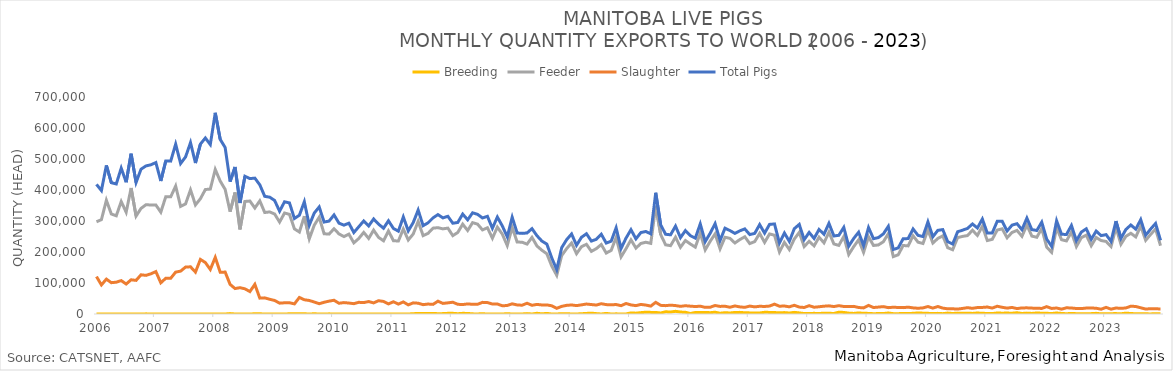
| Category | Breeding | Feeder | Slaughter | Total Pigs |
|---|---|---|---|---|
| 2006-01-01 | 0 | 297447 | 120678 | 418125 |
| 2006-02-01 | 0 | 304391 | 93850 | 398241 |
| 2006-03-01 | 0 | 366922 | 112463 | 479385 |
| 2006-04-01 | 0 | 322576 | 101014 | 423590 |
| 2006-05-01 | 63 | 316770 | 102650 | 419483 |
| 2006-06-01 | 0 | 362766 | 107709 | 470475 |
| 2006-07-01 | 30 | 328287 | 96732 | 425049 |
| 2006-08-01 | 0 | 406543 | 110414 | 516957 |
| 2006-09-01 | 33 | 315905 | 108424 | 424362 |
| 2006-10-01 | 0 | 340597 | 126430 | 467027 |
| 2006-11-01 | 440 | 352593 | 124639 | 477672 |
| 2006-12-01 | 165 | 351560 | 129659 | 481384 |
| 2007-01-01 | 0 | 351636 | 136779 | 488415 |
| 2007-02-01 | 0 | 328388 | 100616 | 429004 |
| 2007-03-01 | 35 | 378236 | 115256 | 493527 |
| 2007-04-01 | 0 | 377961 | 115205 | 493166 |
| 2007-05-01 | 0 | 412787 | 135126 | 547913 |
| 2007-06-01 | 257 | 346964 | 138235 | 485456 |
| 2007-07-01 | 0 | 355162 | 151386 | 506548 |
| 2007-08-01 | 68 | 400449 | 152234 | 552751 |
| 2007-09-01 | 0 | 351861 | 135181 | 487042 |
| 2007-10-01 | 263 | 371849 | 176091 | 548203 |
| 2007-11-01 | 239 | 401520 | 166018 | 567777 |
| 2007-12-01 | 0 | 402997 | 143666 | 546663 |
| 2008-01-01 | 0 | 466316 | 182589 | 648905 |
| 2008-02-01 | 0 | 428897 | 134458 | 563355 |
| 2008-03-01 | 0 | 401888 | 135245 | 537133 |
| 2008-04-01 | 1308 | 330161 | 95526 | 426995 |
| 2008-05-01 | 10 | 391884 | 82110 | 474004 |
| 2008-06-01 | 181 | 272987 | 84908 | 358076 |
| 2008-07-01 | 48 | 363040 | 81178 | 444266 |
| 2008-08-01 | 9 | 364445 | 72348 | 436802 |
| 2008-09-01 | 732 | 341870 | 95682 | 438284 |
| 2008-10-01 | 597 | 364940 | 51212 | 416749 |
| 2008-11-01 | 60 | 327367 | 52035 | 379462 |
| 2008-12-01 | 0 | 329377 | 47489 | 376866 |
| 2009-01-01 | 36 | 322492 | 43630 | 366158 |
| 2009-02-01 | 0 | 296571 | 34952 | 331523 |
| 2009-03-01 | 0 | 325809 | 36157 | 361966 |
| 2009-04-01 | 652 | 321444 | 36235 | 358331 |
| 2009-05-01 | 661 | 274610 | 32696 | 307967 |
| 2009-06-01 | 860 | 264404 | 53393 | 318657 |
| 2009-07-01 | 699 | 315574 | 45875 | 362148 |
| 2009-08-01 | 0 | 242617 | 43660 | 286277 |
| 2009-09-01 | 699 | 286274 | 38650 | 325623 |
| 2009-10-01 | 0 | 312087 | 33133 | 345220 |
| 2009-11-01 | 0 | 258838 | 37849 | 296687 |
| 2009-12-01 | 464 | 257739 | 41527 | 299730 |
| 2010-01-01 | 62 | 275147 | 44302 | 319511 |
| 2010-02-01 | 0 | 258355 | 34629 | 292984 |
| 2010-03-01 | 40 | 249785 | 36781 | 286606 |
| 2010-04-01 | 0 | 257609 | 35324 | 292933 |
| 2010-05-01 | 0 | 229478 | 33339 | 262817 |
| 2010-06-01 | 144 | 243571 | 37670 | 281385 |
| 2010-07-01 | 97 | 263197 | 36819 | 300113 |
| 2010-08-01 | 30 | 243831 | 40177 | 284038 |
| 2010-09-01 | 175 | 270570 | 35800 | 306545 |
| 2010-10-01 | 0 | 246989 | 42901 | 289890 |
| 2010-11-01 | 0 | 236223 | 40496 | 276719 |
| 2010-12-01 | 348 | 267674 | 32633 | 300655 |
| 2011-01-01 | 0 | 236500 | 39465 | 275965 |
| 2011-02-01 | 0 | 235276 | 31935 | 267211 |
| 2011-03-01 | 0 | 274140 | 38928 | 313068 |
| 2011-04-01 | 0 | 238718 | 29365 | 268083 |
| 2011-05-01 | 987 | 257985 | 35940 | 294912 |
| 2011-06-01 | 1735 | 298761 | 34802 | 335298 |
| 2011-07-01 | 1993 | 252776 | 30144 | 284913 |
| 2011-08-01 | 1885 | 260143 | 32111 | 294139 |
| 2011-09-01 | 2013 | 277012 | 31053 | 310078 |
| 2011-10-01 | 930 | 278428 | 41320 | 320678 |
| 2011-11-01 | 1240 | 274643 | 34145 | 310028 |
| 2011-12-01 | 2098 | 277042 | 36004 | 315144 |
| 2012-01-01 | 2134 | 252762 | 37965 | 292861 |
| 2012-02-01 | 974 | 263000 | 31278 | 295252 |
| 2012-03-01 | 2089 | 289812 | 30453 | 322354 |
| 2012-04-01 | 1912 | 269349 | 32556 | 303817 |
| 2012-05-01 | 425 | 294715 | 31274 | 326414 |
| 2012-06-01 | 262 | 289892 | 31360 | 321514 |
| 2012-07-01 | 827 | 271315 | 37552 | 309694 |
| 2012-08-01 | 0 | 278187 | 36849 | 315036 |
| 2012-09-01 | 0 | 244457 | 32154 | 276611 |
| 2012-10-01 | 313 | 280204 | 32286 | 312803 |
| 2012-11-01 | 0 | 257694 | 26543 | 284237 |
| 2012-12-01 | 987 | 220775 | 27409 | 249171 |
| 2013-01-01 | 0 | 279253 | 32839 | 312092 |
| 2013-02-01 | 30 | 232147 | 29209 | 261386 |
| 2013-03-01 | 110 | 231593 | 28348 | 260051 |
| 2013-04-01 | 1256 | 225444 | 34698 | 261398 |
| 2013-05-01 | 0 | 247243 | 28142 | 275385 |
| 2013-06-01 | 2302 | 219361 | 30939 | 252602 |
| 2013-07-01 | 487 | 205628 | 29121 | 235236 |
| 2013-08-01 | 1895 | 194278 | 29382 | 225555 |
| 2013-09-01 | 0 | 154378 | 26420 | 180798 |
| 2013-10-01 | 121 | 124748 | 18226 | 143095 |
| 2013-11-01 | 940 | 188326 | 24684 | 213950 |
| 2013-12-01 | 1073 | 210876 | 27900 | 239849 |
| 2014-01-01 | 56 | 228971 | 29151 | 258178 |
| 2014-02-01 | 33 | 194567 | 27073 | 221673 |
| 2014-03-01 | 886 | 217092 | 29492 | 247470 |
| 2014-04-01 | 1859 | 224814 | 32133 | 258806 |
| 2014-05-01 | 2678 | 202096 | 30468 | 235242 |
| 2014-06-01 | 1234 | 210854 | 28858 | 240946 |
| 2014-07-01 | 0 | 224106 | 33211 | 257317 |
| 2014-08-01 | 1979 | 196569 | 30288 | 228836 |
| 2014-09-01 | 21 | 205157 | 29686 | 234864 |
| 2014-10-01 | 468 | 247019 | 30536 | 278023 |
| 2014-11-01 | 110 | 184265 | 26869 | 211244 |
| 2014-12-01 | 200 | 210657 | 33884 | 244741 |
| 2015-01-01 | 3581 | 239138 | 29273 | 271992 |
| 2015-02-01 | 2670 | 212684 | 27004 | 242358 |
| 2015-03-01 | 4363 | 227497 | 30897 | 262757 |
| 2015-04-01 | 5794 | 231501 | 28838 | 266133 |
| 2015-05-01 | 5207 | 227838 | 25498 | 258543 |
| 2015-06-01 | 5111 | 348378 | 37580 | 391069 |
| 2015-07-01 | 3245 | 256363 | 27930 | 287538 |
| 2015-08-01 | 7088 | 223155 | 26934 | 257177 |
| 2015-09-01 | 6413 | 220516 | 28565 | 255494 |
| 2015-10-01 | 8664 | 247636 | 27156 | 283456 |
| 2015-11-01 | 6273 | 215339 | 24673 | 246285 |
| 2015-12-01 | 5483 | 237007 | 26660 | 269150 |
| 2016-01-01 | 1573 | 225750 | 25277 | 252600 |
| 2016-02-01 | 4961 | 215662 | 24101 | 244724 |
| 2016-03-01 | 4529 | 260893 | 25171 | 290593 |
| 2016-04-01 | 5167 | 206829 | 21381 | 233377 |
| 2016-05-01 | 4244 | 234384 | 21888 | 260516 |
| 2016-06-01 | 5815 | 258167 | 27363 | 291345 |
| 2016-07-01 | 2386 | 210143 | 24466 | 236995 |
| 2016-08-01 | 4247 | 247423 | 25060 | 276730 |
| 2016-09-01 | 3276 | 244027 | 21782 | 269085 |
| 2016-10-01 | 4988 | 229041 | 26003 | 260032 |
| 2016-11-01 | 5256 | 240172 | 22931 | 268359 |
| 2016-12-01 | 3880 | 249114 | 21487 | 274481 |
| 2017-01-01 | 3585 | 227127 | 25537 | 256249 |
| 2017-02-01 | 3533 | 233500 | 22953 | 259986 |
| 2017-03-01 | 3367 | 260128 | 24883 | 288378 |
| 2017-04-01 | 5469 | 230970 | 24316 | 260755 |
| 2017-05-01 | 5162 | 258301 | 25618 | 289081 |
| 2017-06-01 | 4612 | 254057 | 31796 | 290465 |
| 2017-07-01 | 3993 | 200078 | 25128 | 229199 |
| 2017-08-01 | 4536 | 231045 | 25768 | 261349 |
| 2017-09-01 | 3131 | 207930 | 23146 | 234207 |
| 2017-10-01 | 5250 | 241845 | 28111 | 275206 |
| 2017-11-01 | 3557 | 263125 | 22318 | 289000 |
| 2017-12-01 | 1418 | 217350 | 21017 | 239785 |
| 2018-01-01 | 1726 | 234540 | 26851 | 263117 |
| 2018-02-01 | 2092 | 219751 | 21825 | 243668 |
| 2018-03-01 | 1599 | 247712 | 23353 | 272664 |
| 2018-04-01 | 2616 | 229472 | 25173 | 257261 |
| 2018-05-01 | 2253 | 263874 | 26278 | 292405 |
| 2018-06-01 | 1777 | 225963 | 23951 | 251691 |
| 2018-07-01 | 5712 | 221256 | 26878 | 253846 |
| 2018-08-01 | 5107 | 249988 | 24314 | 279409 |
| 2018-09-01 | 2754 | 191942 | 24093 | 218789 |
| 2018-10-01 | 1868 | 217135 | 24599 | 243602 |
| 2018-11-01 | 3425 | 239317 | 21023 | 263765 |
| 2018-12-01 | 2206 | 198839 | 19657 | 220702 |
| 2019-01-01 | 1957 | 249240 | 27672 | 278869 |
| 2019-02-01 | 996 | 221029 | 20901 | 242926 |
| 2019-03-01 | 1396 | 222820 | 22309 | 246525 |
| 2019-04-01 | 1550 | 233191 | 23796 | 258537 |
| 2019-05-01 | 3113 | 259184 | 20498 | 282795 |
| 2019-06-01 | 1169 | 185102 | 21836 | 208107 |
| 2019-07-01 | 1163 | 191043 | 21047 | 213253 |
| 2019-08-01 | 1379 | 221025 | 20550 | 242954 |
| 2019-09-01 | 1420 | 219735 | 22066 | 243221 |
| 2019-10-01 | 2221 | 252254 | 19734 | 274209 |
| 2019-11-01 | 3388 | 231735 | 18529 | 253652 |
| 2019-12-01 | 2694 | 227411 | 19702 | 249807 |
| 2020-01-01 | 2156 | 271277 | 24020 | 297453 |
| 2020-02-01 | 1286 | 228885 | 19009 | 249180 |
| 2020-03-01 | 2047 | 243683 | 24133 | 269863 |
| 2020-04-01 | 1075 | 252104 | 19051 | 272230 |
| 2020-05-01 | 2930 | 213820 | 16692 | 233442 |
| 2020-06-01 | 1578 | 207298 | 16776 | 225652 |
| 2020-07-01 | 2831 | 246440 | 15937 | 265208 |
| 2020-08-01 | 2155 | 250357 | 17927 | 270439 |
| 2020-09-01 | 2664 | 252944 | 20435 | 276043 |
| 2020-10-01 | 1916 | 270241 | 18300 | 290457 |
| 2020-11-01 | 3241 | 253407 | 20821 | 277469 |
| 2020-12-01 | 2138 | 283003 | 21192 | 306333 |
| 2021-01-01 | 1864 | 236861 | 22467 | 261192 |
| 2021-02-01 | 1522 | 240885 | 19141 | 261548 |
| 2021-03-01 | 3149 | 270694 | 25029 | 298872 |
| 2021-04-01 | 2719 | 274813 | 21643 | 299175 |
| 2021-05-01 | 2980 | 245929 | 18958 | 267867 |
| 2021-06-01 | 2532 | 263060 | 21162 | 286754 |
| 2021-07-01 | 4087 | 269667 | 17495 | 291249 |
| 2021-08-01 | 1703 | 250653 | 19566 | 271922 |
| 2021-09-01 | 2829 | 286739 | 19847 | 309415 |
| 2021-10-01 | 1892 | 251273 | 18994 | 272159 |
| 2021-11-01 | 3315 | 247501 | 18628 | 269444 |
| 2021-12-01 | 2551 | 275791 | 17953 | 296295 |
| 2022-01-01 | 2276 | 215666 | 23698 | 241640 |
| 2022-02-01 | 1545 | 198800 | 17871 | 218216 |
| 2022-03-01 | 3238 | 278105 | 19352 | 300695 |
| 2022-04-01 | 1797 | 239587 | 15614 | 256998 |
| 2022-05-01 | 882 | 235756 | 20057 | 256695 |
| 2022-06-01 | 1929 | 264401 | 19317 | 285647 |
| 2022-07-01 | 1049 | 217646 | 17760 | 236455 |
| 2022-08-01 | 850 | 246124 | 17360 | 264334 |
| 2022-09-01 | 1136 | 254465 | 19188 | 274789 |
| 2022-10-01 | 1207 | 220249 | 19360 | 240816 |
| 2022-11-01 | 2104 | 246798 | 18589 | 267491 |
| 2022-12-01 | 435 | 236908 | 15413 | 252756 |
| 2023-01-01 | 655 | 234055 | 21388 | 256098 |
| 2023-02-01 | 1140 | 217626 | 15572 | 234338 |
| 2023-03-01 | 1276 | 279038 | 19347 | 299661 |
| 2023-04-01 | 768 | 225078 | 18183 | 244029 |
| 2023-05-01 | 2752 | 250458 | 19502 | 272712 |
| 2023-06-01 | 1589 | 260396 | 25169 | 287154 |
| 2023-07-01 | 747 | 248621 | 24225 | 273593 |
| 2023-08-01 | 848 | 283457 | 20039 | 304344 |
| 2023-09-01 | 543 | 237668 | 15907 | 254118 |
| 2023-10-01 | 269 | 256579 | 17184 | 274032 |
| 2023-11-01 | 944 | 274325 | 16813 | 292082 |
| 2023-12-01 | 1075 | 220326 | 16294 | 237695 |